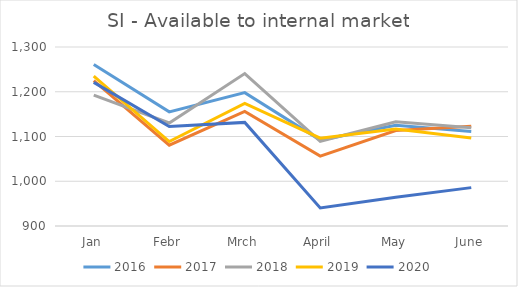
| Category | 2016 | 2017 | 2018 | 2019 | 2020 |
|---|---|---|---|---|---|
| Jan | 1261 | 1224.784 | 1192.617 | 1234.858 | 1221.044 |
| Febr | 1155 | 1080.615 | 1130.128 | 1088.714 | 1122.232 |
| Mrch | 1198 | 1155.908 | 1240.659 | 1174.146 | 1131.501 |
| April | 1092 | 1056.259 | 1089.227 | 1096.247 | 940.506 |
| May | 1125 | 1113.236 | 1132.984 | 1117.008 | 964.306 |
| June | 1111 | 1122.704 | 1119.649 | 1096.623 | 985.768 |